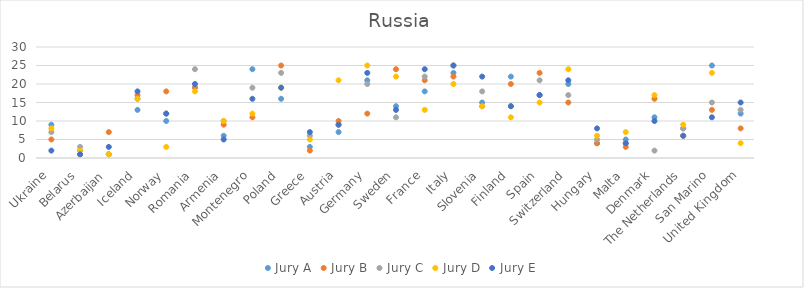
| Category | Jury A | Jury B | Jury C | Jury D | Jury E |
|---|---|---|---|---|---|
| Ukraine | 9 | 5 | 7 | 8 | 2 |
| Belarus | 2 | 1 | 3 | 2 | 1 |
| Azerbaijan | 1 | 7 | 1 | 1 | 3 |
| Iceland | 13 | 17 | 16 | 16 | 18 |
| Norway | 10 | 18 | 12 | 3 | 12 |
| Romania | 19 | 19 | 24 | 18 | 20 |
| Armenia | 6 | 9 | 10 | 10 | 5 |
| Montenegro | 24 | 11 | 19 | 12 | 16 |
| Poland | 16 | 25 | 23 | 19 | 19 |
| Greece | 3 | 2 | 6 | 5 | 7 |
| Austria | 7 | 10 | 9 | 21 | 9 |
| Germany | 21 | 12 | 20 | 25 | 23 |
| Sweden | 14 | 24 | 11 | 22 | 13 |
| France | 18 | 21 | 22 | 13 | 24 |
| Italy | 23 | 22 | 25 | 20 | 25 |
| Slovenia | 15 | 14 | 18 | 14 | 22 |
| Finland | 22 | 20 | 14 | 11 | 14 |
| Spain | 17 | 23 | 21 | 15 | 17 |
| Switzerland | 20 | 15 | 17 | 24 | 21 |
| Hungary | 4 | 4 | 5 | 6 | 8 |
| Malta | 5 | 3 | 4 | 7 | 4 |
| Denmark | 11 | 16 | 2 | 17 | 10 |
| The Netherlands | 8 | 6 | 8 | 9 | 6 |
| San Marino | 25 | 13 | 15 | 23 | 11 |
| United Kingdom | 12 | 8 | 13 | 4 | 15 |